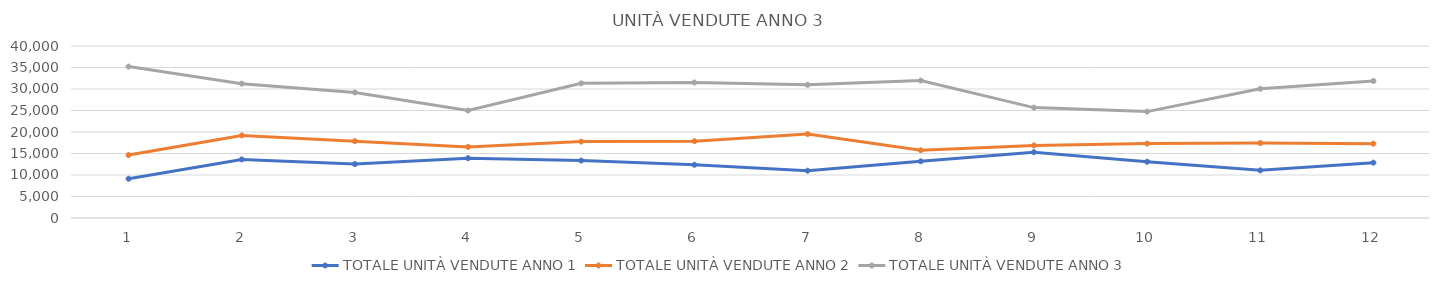
| Category | TOTALE UNITÀ VENDUTE ANNO 1 | TOTALE UNITÀ VENDUTE ANNO 2 | TOTALE UNITÀ VENDUTE ANNO 3 |
|---|---|---|---|
| 0 | 9129 | 14647 | 35215 |
| 1 | 13628 | 19204 | 31243 |
| 2 | 12539 | 17864 | 29198 |
| 3 | 13910 | 16530 | 24992 |
| 4 | 13356 | 17775 | 31314 |
| 5 | 12381 | 17858 | 31508 |
| 6 | 11005 | 19508 | 30973 |
| 7 | 13184 | 15750 | 31959 |
| 8 | 15306 | 16882 | 25671 |
| 9 | 13088 | 17301 | 24743 |
| 10 | 11079 | 17423 | 30043 |
| 11 | 12870 | 17275 | 31855 |